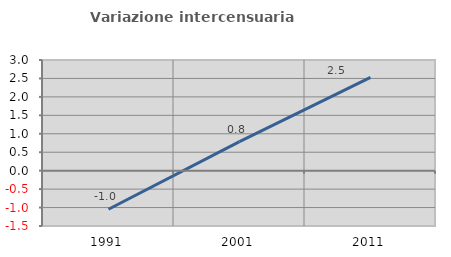
| Category | Variazione intercensuaria annua |
|---|---|
| 1991.0 | -1.046 |
| 2001.0 | 0.788 |
| 2011.0 | 2.529 |